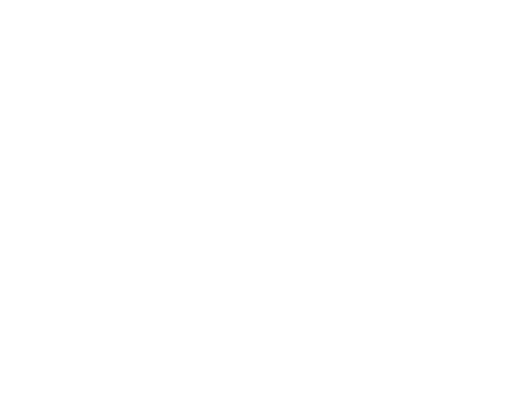
| Category | Series 0 | Series 1 | Series 2 |
|---|---|---|---|
| Impuestos | 12571619.81 | 0.115 |  |
| Cuotas y Aportaciones de Seguridad Social | 0 | 0 |  |
| Contribuciones de Mejoras | 0 | 0 |  |
| Derechos | 16144715.32 | 0.148 |  |
| Productos | 10757.73 | 0 |  |
| Aprovechamientos | 1189857.18 | 0.011 |  |
| Ingresos por Ventas de Bienes y Servicios | 0 | 0 |  |
| Participaciones y Aportaciones | 79246963.24 | 0.726 |  |
| Transferencias, Asignaciones, Subsidios y Otras Ayudas | 0 | 0 |  |
| Ingresos Derivados de Financiamientos | 0 | 0 |  |